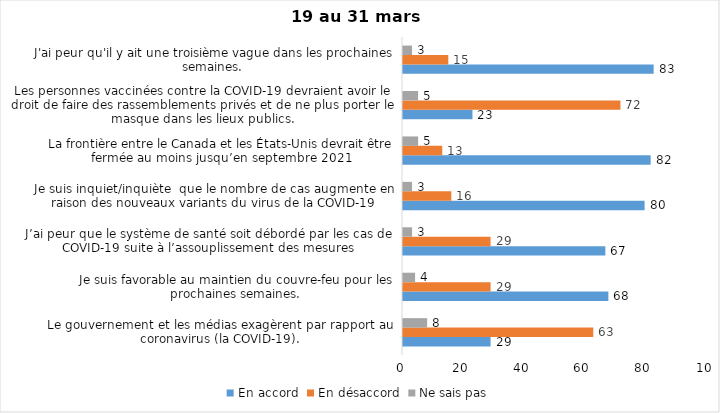
| Category | En accord | En désaccord | Ne sais pas |
|---|---|---|---|
| Le gouvernement et les médias exagèrent par rapport au coronavirus (la COVID-19). | 29 | 63 | 8 |
| Je suis favorable au maintien du couvre-feu pour les prochaines semaines. | 68 | 29 | 4 |
| J’ai peur que le système de santé soit débordé par les cas de COVID-19 suite à l’assouplissement des mesures | 67 | 29 | 3 |
| Je suis inquiet/inquiète  que le nombre de cas augmente en raison des nouveaux variants du virus de la COVID-19 | 80 | 16 | 3 |
| La frontière entre le Canada et les États-Unis devrait être fermée au moins jusqu’en septembre 2021 | 82 | 13 | 5 |
| Les personnes vaccinées contre la COVID-19 devraient avoir le droit de faire des rassemblements privés et de ne plus porter le masque dans les lieux publics. | 23 | 72 | 5 |
| J'ai peur qu'il y ait une troisième vague dans les prochaines semaines. | 83 | 15 | 3 |